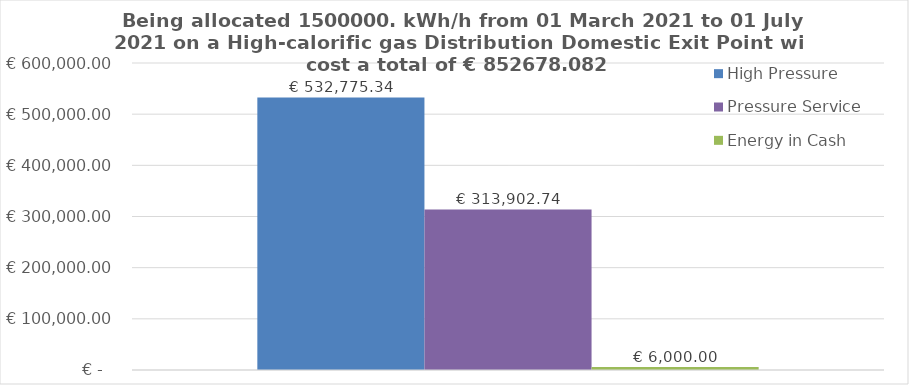
| Category | High Pressure | Pressure Service | Energy in Cash  |
|---|---|---|---|
|  | 532775.342 | 313902.74 | 6000 |